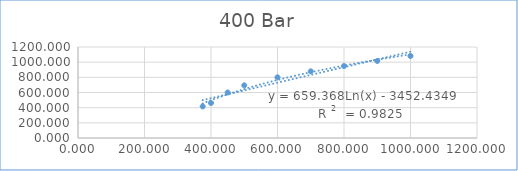
| Category | Series 0 |
|---|---|
| 375.0 | 416.292 |
| 400.0 | 461.395 |
| 450.0 | 600.048 |
| 500.0 | 694.338 |
| 600.0 | 800.382 |
| 700.0 | 878.906 |
| 800.0 | 949.021 |
| 900.0 | 1015.886 |
| 1000.0 | 1081.534 |